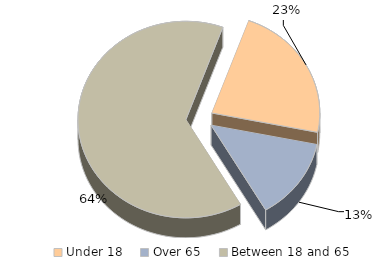
| Category | County |
|---|---|
| Under 18  | 0.226 |
| Over 65  | 0.134 |
| Between 18 and 65 | 0.64 |